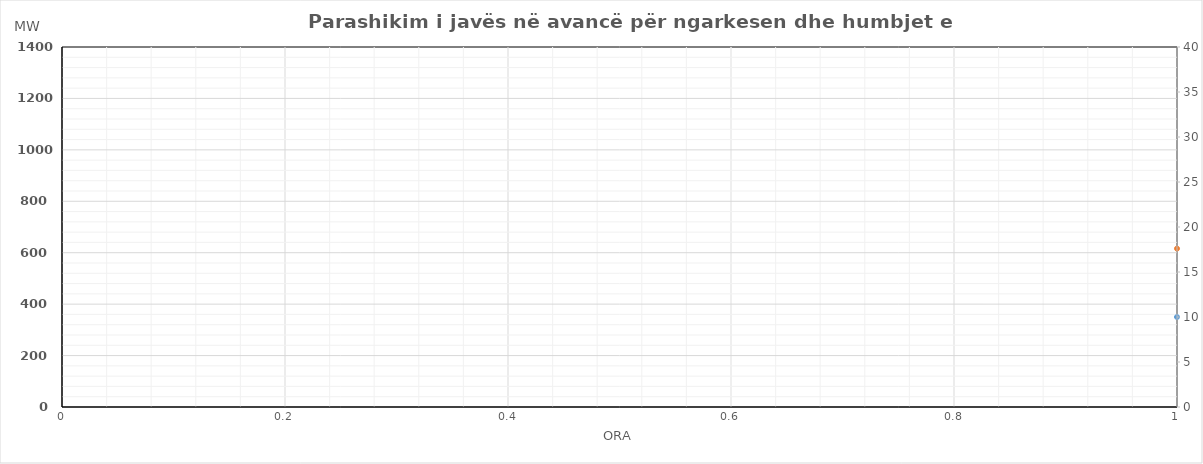
| Category | Ngarkesa (MWh) |
|---|---|
| 0 | 616 |
| 1 | 559 |
| 2 | 535 |
| 3 | 525 |
| 4 | 535 |
| 5 | 599 |
| 6 | 757 |
| 7 | 916 |
| 8 | 1011 |
| 9 | 1006 |
| 10 | 974 |
| 11 | 943 |
| 12 | 929 |
| 13 | 937 |
| 14 | 916 |
| 15 | 893 |
| 16 | 900 |
| 17 | 958 |
| 18 | 1095 |
| 19 | 1142 |
| 20 | 1105 |
| 21 | 1015 |
| 22 | 879 |
| 23 | 712 |
| 24 | 626 |
| 25 | 569 |
| 26 | 545 |
| 27 | 535 |
| 28 | 545 |
| 29 | 609 |
| 30 | 767 |
| 31 | 926 |
| 32 | 1021 |
| 33 | 1016 |
| 34 | 984 |
| 35 | 953 |
| 36 | 939 |
| 37 | 947 |
| 38 | 926 |
| 39 | 903 |
| 40 | 910 |
| 41 | 968 |
| 42 | 1105 |
| 43 | 1152 |
| 44 | 1115 |
| 45 | 1025 |
| 46 | 889 |
| 47 | 722 |
| 48 | 622 |
| 49 | 564 |
| 50 | 534 |
| 51 | 527 |
| 52 | 542 |
| 53 | 613 |
| 54 | 774 |
| 55 | 973 |
| 56 | 998 |
| 57 | 956 |
| 58 | 909 |
| 59 | 882 |
| 60 | 866 |
| 61 | 876 |
| 62 | 909 |
| 63 | 910 |
| 64 | 924 |
| 65 | 982 |
| 66 | 1115 |
| 67 | 1157 |
| 68 | 1128 |
| 69 | 1035 |
| 70 | 880 |
| 71 | 717 |
| 72 | 618 |
| 73 | 561 |
| 74 | 537 |
| 75 | 527 |
| 76 | 537 |
| 77 | 601 |
| 78 | 759 |
| 79 | 918 |
| 80 | 1013 |
| 81 | 1008 |
| 82 | 976 |
| 83 | 945 |
| 84 | 931 |
| 85 | 939 |
| 86 | 918 |
| 87 | 895 |
| 88 | 902 |
| 89 | 960 |
| 90 | 1097 |
| 91 | 1144 |
| 92 | 1107 |
| 93 | 1017 |
| 94 | 881 |
| 95 | 714 |
| 96 | 611 |
| 97 | 554 |
| 98 | 530 |
| 99 | 520 |
| 100 | 530 |
| 101 | 594 |
| 102 | 752 |
| 103 | 911 |
| 104 | 1006 |
| 105 | 1001 |
| 106 | 969 |
| 107 | 938 |
| 108 | 924 |
| 109 | 932 |
| 110 | 911 |
| 111 | 888 |
| 112 | 895 |
| 113 | 953 |
| 114 | 1090 |
| 115 | 1137 |
| 116 | 1100 |
| 117 | 1010 |
| 118 | 874 |
| 119 | 707 |
| 120 | 614 |
| 121 | 556 |
| 122 | 526 |
| 123 | 519 |
| 124 | 534 |
| 125 | 605 |
| 126 | 766 |
| 127 | 965 |
| 128 | 990 |
| 129 | 948 |
| 130 | 901 |
| 131 | 874 |
| 132 | 858 |
| 133 | 868 |
| 134 | 901 |
| 135 | 902 |
| 136 | 916 |
| 137 | 974 |
| 138 | 1107 |
| 139 | 1149 |
| 140 | 1120 |
| 141 | 1027 |
| 142 | 872 |
| 143 | 709 |
| 144 | 617 |
| 145 | 559 |
| 146 | 529 |
| 147 | 522 |
| 148 | 537 |
| 149 | 608 |
| 150 | 769 |
| 151 | 968 |
| 152 | 993 |
| 153 | 951 |
| 154 | 904 |
| 155 | 877 |
| 156 | 861 |
| 157 | 871 |
| 158 | 904 |
| 159 | 905 |
| 160 | 919 |
| 161 | 977 |
| 162 | 1110 |
| 163 | 1152 |
| 164 | 1123 |
| 165 | 1030 |
| 166 | 875 |
| 167 | 712 |